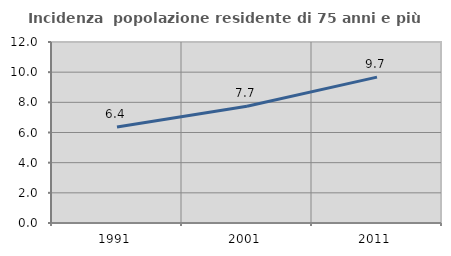
| Category | Incidenza  popolazione residente di 75 anni e più |
|---|---|
| 1991.0 | 6.362 |
| 2001.0 | 7.741 |
| 2011.0 | 9.673 |